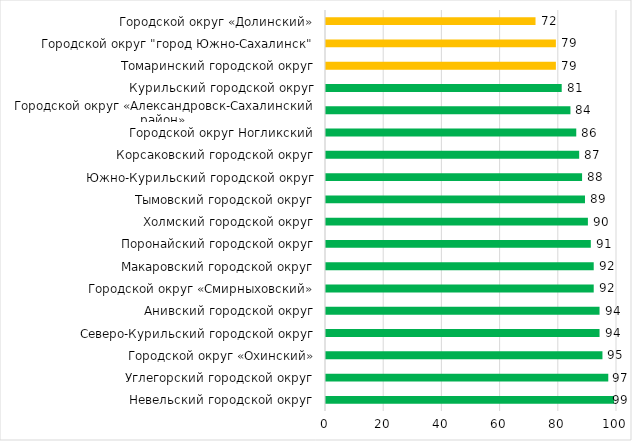
| Category | Series 0 |
|---|---|
| Невельский городской округ | 99 |
| Углегорский городской округ | 97 |
| Городской округ «Охинский» | 95 |
| Северо-Курильский городской округ | 94 |
| Анивский городской округ | 94 |
| Городской округ «Смирныховский» | 92 |
| Макаровский городской округ | 92 |
| Поронайский городской округ | 91 |
| Холмский городской округ | 90 |
| Тымовский городской округ | 89 |
| Южно-Курильский городской округ | 88 |
| Корсаковский городской округ | 87 |
| Городской округ Ногликский | 86 |
| Городской округ «Александровск-Сахалинский район»  | 84 |
| Курильский городской округ | 81 |
| Томаринский городской округ | 79 |
| Городской округ "город Южно-Сахалинск" | 79 |
| Городской округ «Долинский» | 72 |